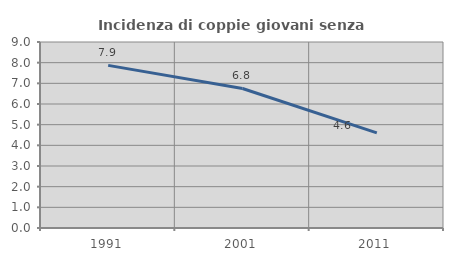
| Category | Incidenza di coppie giovani senza figli |
|---|---|
| 1991.0 | 7.87 |
| 2001.0 | 6.751 |
| 2011.0 | 4.603 |